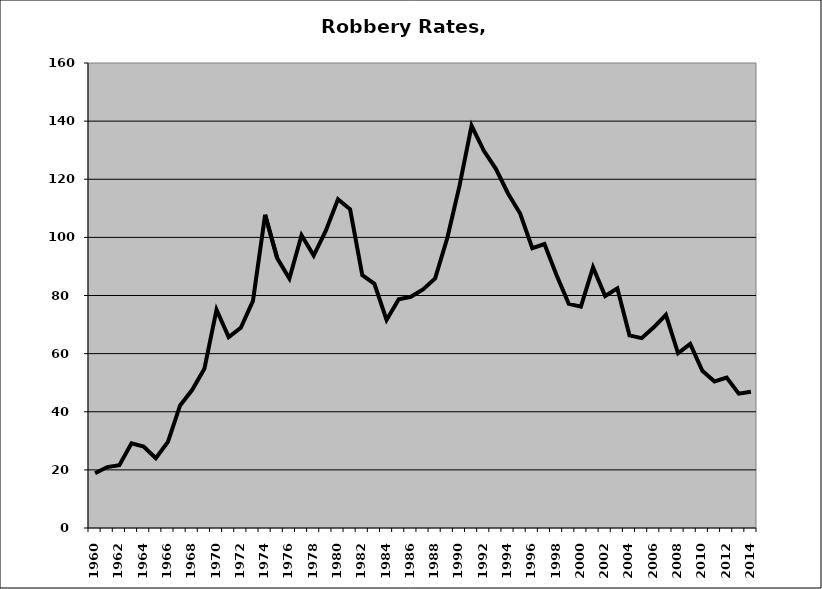
| Category | Robbery |
|---|---|
| 1960.0 | 18.819 |
| 1961.0 | 20.966 |
| 1962.0 | 21.631 |
| 1963.0 | 29.124 |
| 1964.0 | 28 |
| 1965.0 | 24.038 |
| 1966.0 | 29.644 |
| 1967.0 | 42.154 |
| 1968.0 | 47.547 |
| 1969.0 | 54.761 |
| 1970.0 | 75.098 |
| 1971.0 | 65.678 |
| 1972.0 | 68.911 |
| 1973.0 | 78.148 |
| 1974.0 | 107.797 |
| 1975.0 | 92.766 |
| 1976.0 | 85.844 |
| 1977.0 | 100.731 |
| 1978.0 | 93.739 |
| 1979.0 | 102.279 |
| 1980.0 | 113.131 |
| 1981.0 | 109.66 |
| 1982.0 | 87.002 |
| 1983.0 | 84.041 |
| 1984.0 | 71.575 |
| 1985.0 | 78.735 |
| 1986.0 | 79.561 |
| 1987.0 | 82.068 |
| 1988.0 | 85.887 |
| 1989.0 | 99.801 |
| 1990.0 | 117.615 |
| 1991.0 | 138.397 |
| 1992.0 | 129.885 |
| 1993.0 | 123.588 |
| 1994.0 | 115.114 |
| 1995.0 | 108.187 |
| 1996.0 | 96.267 |
| 1997.0 | 97.688 |
| 1998.0 | 86.991 |
| 1999.0 | 77.127 |
| 2000.0 | 76.179 |
| 2001.0 | 89.67 |
| 2002.0 | 79.837 |
| 2003.0 | 82.465 |
| 2004.0 | 66.284 |
| 2005.0 | 65.316 |
| 2006.0 | 69.065 |
| 2007.0 | 73.343 |
| 2008.0 | 60.128 |
| 2009.0 | 63.361 |
| 2010.0 | 54.116 |
| 2011.0 | 50.446 |
| 2012.0 | 51.743 |
| 2013.0 | 46.239 |
| 2014.0 | 46.9 |